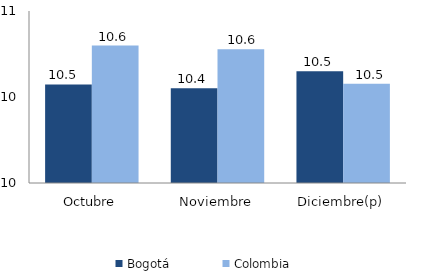
| Category | Bogotá | Colombia |
|---|---|---|
| Octubre | 10.458 | 10.639 |
| Noviembre | 10.441 | 10.623 |
| Diciembre(p) | 10.52 | 10.462 |